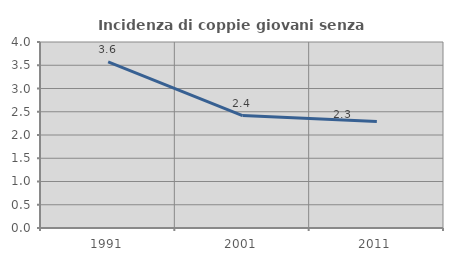
| Category | Incidenza di coppie giovani senza figli |
|---|---|
| 1991.0 | 3.571 |
| 2001.0 | 2.419 |
| 2011.0 | 2.292 |